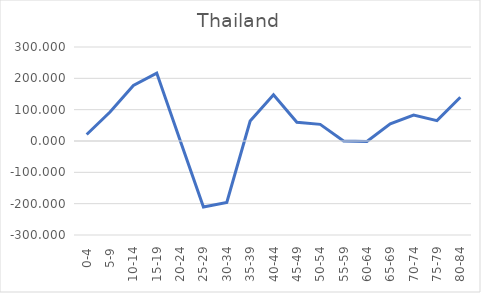
| Category | Series 0 |
|---|---|
| 0-4 | 20.801 |
| 5-9 | 92.303 |
| 10-14 | 177.101 |
| 15-19 | 216.618 |
| 20-24 | 2.277 |
| 25-29 | -210.709 |
| 30-34 | -196.307 |
| 35-39 | 63.775 |
| 40-44 | 147.518 |
| 45-49 | 59.734 |
| 50-54 | 53.131 |
| 55-59 | 0.112 |
| 60-64 | -1.735 |
| 65-69 | 54.842 |
| 70-74 | 82.513 |
| 75-79 | 65.14 |
| 80-84 | 139.741 |